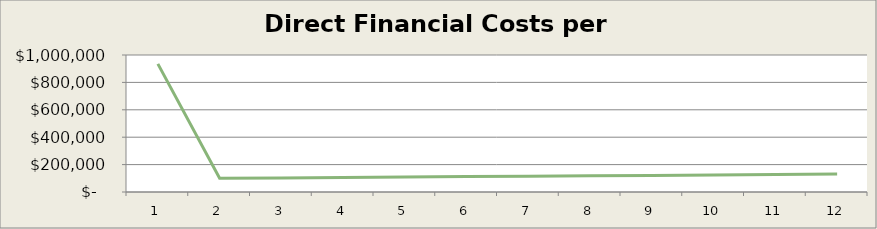
| Category | Series 0 |
|---|---|
| 0 | 935027.289 |
| 1 | 100056.345 |
| 2 | 102951.463 |
| 3 | 105964.487 |
| 4 | 109008.822 |
| 5 | 112292.071 |
| 6 | 115379.854 |
| 7 | 118399.823 |
| 8 | 121349.482 |
| 9 | 124328.409 |
| 10 | 127357.504 |
| 11 | 130491.744 |